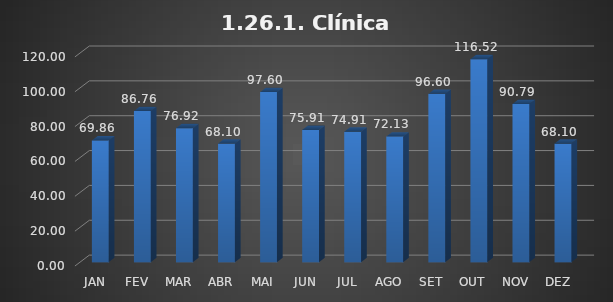
| Category | 1.26.1. Clínica Médica  |
|---|---|
|  JAN  | 69.861 |
|  FEV  | 86.759 |
|  MAR  | 76.923 |
|  ABR  | 68.096 |
|  MAI  | 97.604 |
|  JUN  | 75.914 |
|  JUL  | 74.905 |
|  AGO  | 72.131 |
|  SET  | 96.595 |
|  OUT  | 116.52 |
|  NOV  | 90.794 |
|  DEZ  | 68.096 |